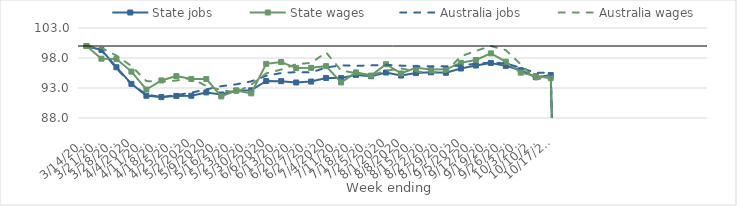
| Category | State jobs | State wages | Australia jobs | Australia wages |
|---|---|---|---|---|
| 14/03/2020 | 100 | 100 | 100 | 100 |
| 21/03/2020 | 99.345 | 97.881 | 99.265 | 99.682 |
| 28/03/2020 | 96.459 | 97.818 | 96.284 | 98.406 |
| 04/04/2020 | 93.691 | 95.732 | 93.626 | 96.656 |
| 11/04/2020 | 91.706 | 92.751 | 91.924 | 94.154 |
| 18/04/2020 | 91.488 | 94.262 | 91.482 | 94.062 |
| 25/04/2020 | 91.678 | 94.987 | 91.821 | 94.245 |
| 02/05/2020 | 91.704 | 94.508 | 92.221 | 94.677 |
| 09/05/2020 | 92.265 | 94.494 | 92.772 | 93.304 |
| 16/05/2020 | 91.922 | 91.602 | 93.305 | 92.652 |
| 23/05/2020 | 92.578 | 92.574 | 93.609 | 92.272 |
| 30/05/2020 | 92.616 | 92.114 | 94.11 | 93.544 |
| 06/06/2020 | 94.164 | 97.02 | 95.034 | 95.442 |
| 13/06/2020 | 94.137 | 97.332 | 95.487 | 96.076 |
| 20/06/2020 | 93.919 | 96.318 | 95.645 | 96.966 |
| 27/06/2020 | 94.073 | 96.365 | 95.594 | 97.186 |
| 04/07/2020 | 94.678 | 96.644 | 96.409 | 98.934 |
| 11/07/2020 | 94.65 | 93.929 | 96.784 | 95.92 |
| 18/07/2020 | 95.178 | 95.599 | 96.696 | 95.473 |
| 25/07/2020 | 94.965 | 95.07 | 96.767 | 95.143 |
| 01/08/2020 | 95.58 | 96.956 | 96.854 | 95.856 |
| 08/08/2020 | 95.077 | 95.423 | 96.728 | 96.257 |
| 15/08/2020 | 95.49 | 96.365 | 96.62 | 95.754 |
| 22/08/2020 | 95.608 | 96.101 | 96.624 | 95.563 |
| 29/08/2020 | 95.536 | 96.116 | 96.609 | 95.684 |
| 05/09/2020 | 96.247 | 97.196 | 96.751 | 98.286 |
| 12/09/2020 | 96.746 | 97.663 | 97.054 | 99.176 |
| 19/09/2020 | 97.178 | 98.77 | 97.226 | 99.992 |
| 26/09/2020 | 96.689 | 97.38 | 97.1 | 99.309 |
| 03/10/2020 | 95.971 | 95.561 | 96.368 | 96.936 |
| 10/10/2020 | 94.803 | 95 | 95.514 | 94.424 |
| 17/10/2020 | 95.155 | 94.64 | 95.573 | 94.889 |